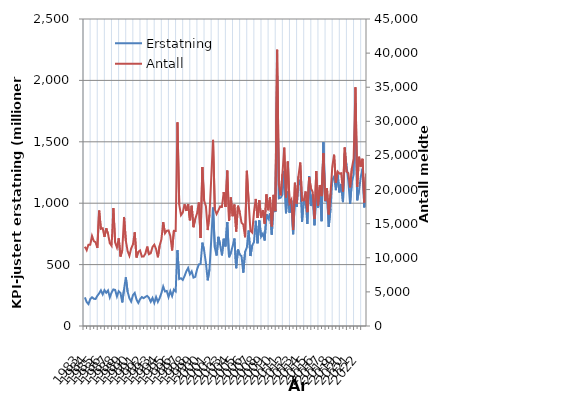
| Category | Erstatning |
|---|---|
| 1983.0 | 232.937 |
| nan | 195.121 |
| nan | 178.438 |
| nan | 218.579 |
| 1984.0 | 234.389 |
| nan | 221.715 |
| nan | 219.826 |
| nan | 245.877 |
| 1985.0 | 265.702 |
| nan | 290.42 |
| nan | 257.346 |
| nan | 291.865 |
| 1986.0 | 270.604 |
| nan | 289.558 |
| nan | 233.055 |
| nan | 272.728 |
| 1987.0 | 297.95 |
| nan | 294.021 |
| nan | 240.61 |
| nan | 283.085 |
| 1988.0 | 269.44 |
| nan | 192.069 |
| nan | 299.153 |
| nan | 396.293 |
| 1989.0 | 279.972 |
| nan | 226.285 |
| nan | 199.112 |
| nan | 251.201 |
| 1990.0 | 268.971 |
| nan | 216.388 |
| nan | 187.666 |
| nan | 218.436 |
| 1991.0 | 235.713 |
| nan | 226.637 |
| nan | 237.191 |
| nan | 245.226 |
| 1992.0 | 229.086 |
| nan | 197.393 |
| nan | 228.083 |
| nan | 188.213 |
| 1993.0 | 236.156 |
| nan | 196.535 |
| nan | 227.061 |
| nan | 268.62 |
| 1994.0 | 321.731 |
| nan | 281.266 |
| nan | 285.763 |
| nan | 235.54 |
| 1995.0 | 283.776 |
| nan | 244.132 |
| nan | 296.645 |
| nan | 281.65 |
| 1996.0 | 617.657 |
| nan | 382.464 |
| nan | 389.296 |
| nan | 375.446 |
| 1997.0 | 406.453 |
| nan | 446.013 |
| nan | 472.333 |
| nan | 421.43 |
| 1998.0 | 444.599 |
| nan | 393.872 |
| nan | 400.307 |
| nan | 460.108 |
| 1999.0 | 501.845 |
| nan | 504.283 |
| nan | 678.577 |
| nan | 614.541 |
| 2000.0 | 512.261 |
| nan | 372.014 |
| nan | 461.192 |
| nan | 703.176 |
| 2001.0 | 965.028 |
| nan | 638.852 |
| nan | 573.774 |
| nan | 725.942 |
| 2002.0 | 661.156 |
| nan | 575.27 |
| nan | 710.935 |
| nan | 647.82 |
| 2003.0 | 847.26 |
| nan | 560.178 |
| nan | 595.958 |
| nan | 649.208 |
| 2004.0 | 712.217 |
| nan | 470.87 |
| nan | 622.509 |
| nan | 581.854 |
| 2005.0 | 569.493 |
| nan | 434.602 |
| nan | 603.345 |
| nan | 639.394 |
| 2006.0 | 777.195 |
| nan | 569.965 |
| nan | 655.815 |
| nan | 684.196 |
| 2007.0 | 856.408 |
| nan | 673.317 |
| nan | 860.276 |
| nan | 727.347 |
| 2008.0 | 752.172 |
| nan | 696.322 |
| nan | 909.437 |
| nan | 873.42 |
| 2009.0 | 916.557 |
| nan | 744.098 |
| nan | 982.934 |
| nan | 929.078 |
| 2010.0 | 2038.021 |
| nan | 1039.492 |
| nan | 1044.493 |
| nan | 1068.56 |
| 2011.0 | 1262.842 |
| nan | 918.31 |
| nan | 1094.943 |
| nan | 922.779 |
| 2012.0 | 1022.313 |
| nan | 747.404 |
| nan | 1030.461 |
| nan | 970.277 |
| 2013.0 | 1191.601 |
| nan | 1166.802 |
| nan | 849.019 |
| nan | 1025.516 |
| 2014.0 | 1011.435 |
| nan | 830.588 |
| nan | 1221.838 |
| nan | 976.933 |
| 2015.0 | 1071.822 |
| nan | 820.828 |
| nan | 1086.542 |
| nan | 964.725 |
| 2016.0 | 1109.027 |
| nan | 853.659 |
| nan | 1497.167 |
| nan | 1015.828 |
| 2017.0 | 1088.954 |
| nan | 807.65 |
| nan | 953.843 |
| nan | 1191.034 |
| 2018.0 | 1215.874 |
| nan | 1106.121 |
| nan | 1232.942 |
| nan | 1087.816 |
| 2019.0 | 1157.146 |
| nan | 1008.947 |
| nan | 1404.229 |
| nan | 1307.73 |
| 2020.0 | 1182.332 |
| nan | 993.156 |
| nan | 1171.889 |
| nan | 1232.253 |
| 2021.0 | 1816.342 |
| nan | 1023.29 |
| nan | 1100.926 |
| nan | 1213.6 |
| 2022.0 | 1280.476 |
| nan | 966.126 |
| nan | 1138.392 |